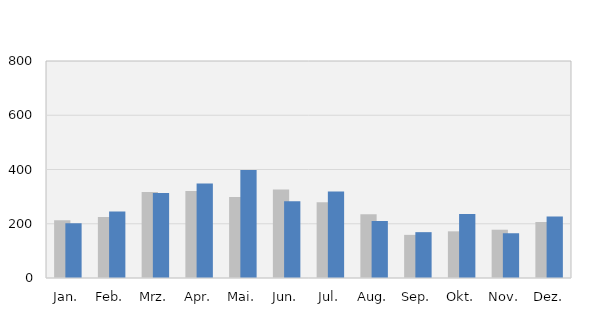
| Category | 2018 | 2019 |
|---|---|---|
| Jan. | 213 | 202 |
| Feb. | 225 | 245 |
| Mrz. | 317 | 313 |
| Apr. | 321 | 348 |
| Mai. | 299 | 398 |
| Jun. | 326 | 283 |
| Jul. | 279 | 319 |
| Aug. | 235 | 210 |
| Sep. | 159 | 169 |
| Okt. | 172 | 236 |
| Nov. | 178 | 165 |
| Dez. | 206 | 227 |